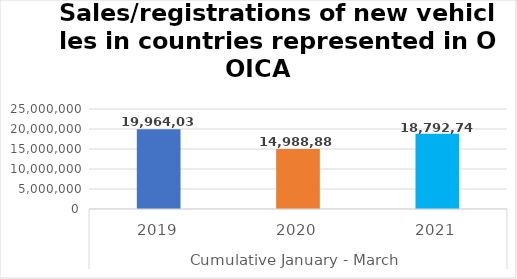
| Category | Series 0 |
|---|---|
| 0 | 19964038 |
| 1 | 14988886 |
| 2 | 18792741 |